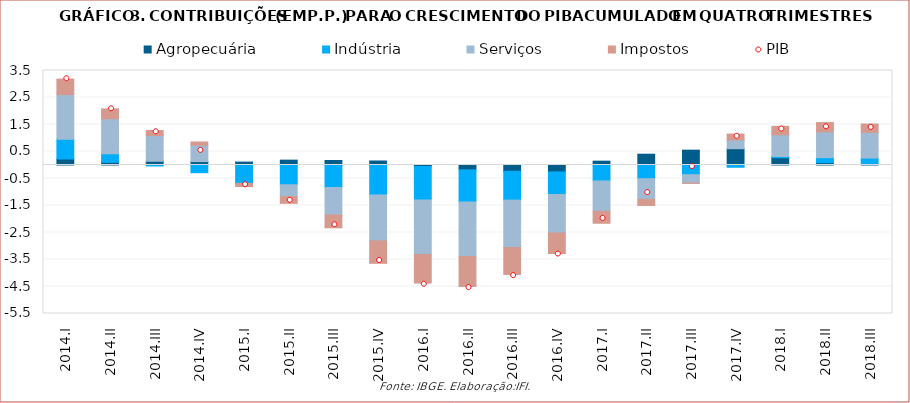
| Category | Agropecuária | Indústria | Serviços | Impostos |
|---|---|---|---|---|
| 2014.I | 0.223 | 0.73 | 1.654 | 0.575 |
| 2014.II | 0.1 | 0.315 | 1.297 | 0.368 |
| 2014.III | 0.139 | -0.036 | 0.95 | 0.189 |
| 2014.IV | 0.125 | -0.286 | 0.61 | 0.117 |
| 2015.I | 0.128 | -0.681 | 0.004 | -0.116 |
| 2015.II | 0.18 | -0.731 | -0.44 | -0.248 |
| 2015.III | 0.168 | -0.833 | -1.023 | -0.47 |
| 2015.IV | 0.149 | -1.11 | -1.702 | -0.83 |
| 2016.I | -0.054 | -1.239 | -2.022 | -1.057 |
| 2016.II | -0.18 | -1.193 | -2.019 | -1.106 |
| 2016.III | -0.234 | -1.067 | -1.757 | -0.996 |
| 2016.IV | -0.256 | -0.836 | -1.425 | -0.763 |
| 2017.I | 0.142 | -0.59 | -1.124 | -0.443 |
| 2017.II | 0.4 | -0.507 | -0.763 | -0.228 |
| 2017.III | 0.549 | -0.357 | -0.312 | -0.012 |
| 2017.IV | 0.603 | -0.084 | 0.326 | 0.217 |
| 2018.I | 0.268 | 0.048 | 0.802 | 0.314 |
| 2018.II | 0.087 | 0.184 | 0.957 | 0.342 |
| 2018.III | 0.016 | 0.239 | 0.953 | 0.311 |